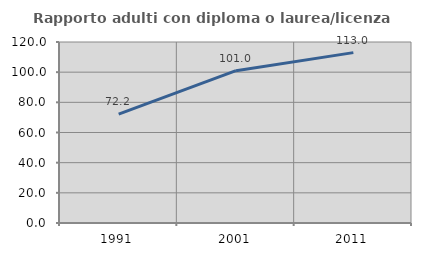
| Category | Rapporto adulti con diploma o laurea/licenza media  |
|---|---|
| 1991.0 | 72.183 |
| 2001.0 | 100.972 |
| 2011.0 | 112.96 |